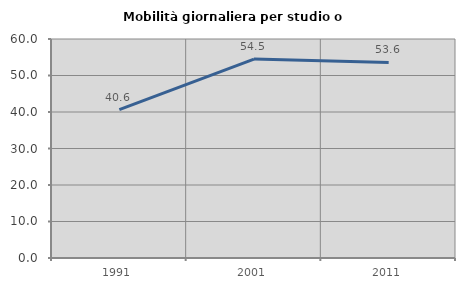
| Category | Mobilità giornaliera per studio o lavoro |
|---|---|
| 1991.0 | 40.645 |
| 2001.0 | 54.511 |
| 2011.0 | 53.589 |